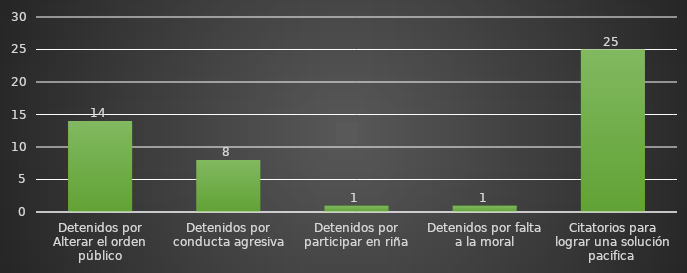
| Category | INDICADOR  |
|---|---|
| Detenidos por Alterar el orden público | 14 |
| Detenidos por conducta agresiva | 8 |
| Detenidos por participar en riña | 1 |
| Detenidos por falta a la moral | 1 |
| Citatorios para lograr una solución pacifica  | 25 |